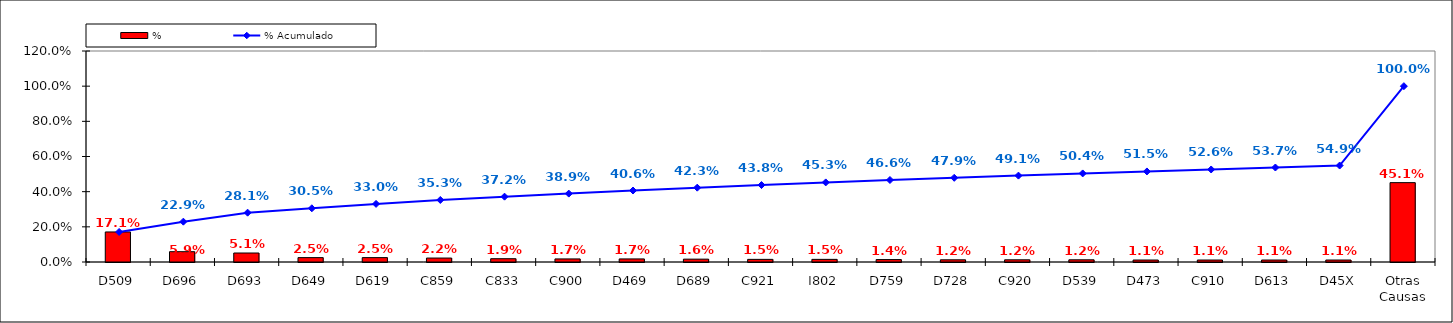
| Category | % |
|---|---|
| D509 | 0.171 |
| D696 | 0.059 |
| D693 | 0.051 |
| D649 | 0.025 |
| D619 | 0.025 |
| C859 | 0.022 |
| C833 | 0.019 |
| C900 | 0.017 |
| D469 | 0.017 |
| D689 | 0.016 |
| C921 | 0.015 |
| I802 | 0.015 |
| D759 | 0.014 |
| D728 | 0.012 |
| C920 | 0.012 |
| D539 | 0.012 |
| D473 | 0.011 |
| C910 | 0.011 |
| D613 | 0.011 |
| D45X | 0.011 |
| Otras Causas | 0.451 |